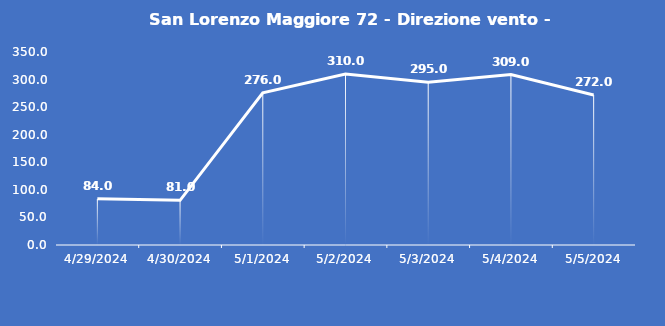
| Category | San Lorenzo Maggiore 72 - Direzione vento - Grezzo (°N) |
|---|---|
| 4/29/24 | 84 |
| 4/30/24 | 81 |
| 5/1/24 | 276 |
| 5/2/24 | 310 |
| 5/3/24 | 295 |
| 5/4/24 | 309 |
| 5/5/24 | 272 |